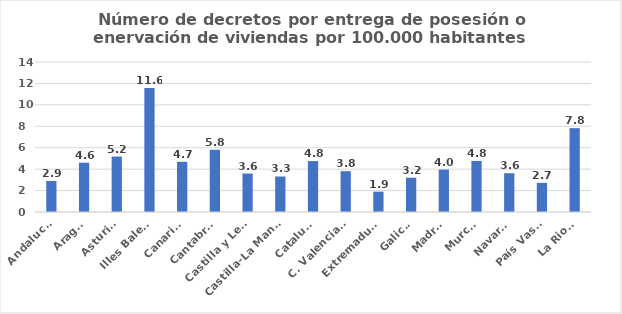
| Category | Numero de decretos por entrega de posesión o enervacion por 100.000 habitantes |
|---|---|
| Andalucía | 2.898 |
| Aragón | 4.603 |
| Asturias | 5.177 |
| Illes Balears | 11.562 |
| Canarias | 4.687 |
| Cantabria | 5.81 |
| Castilla y León | 3.586 |
| Castilla-La Mancha | 3.314 |
| Cataluña | 4.754 |
| C. Valenciana | 3.811 |
| Extremadura | 1.897 |
| Galicia | 3.198 |
| Madrid | 3.959 |
| Murcia | 4.767 |
| Navarra | 3.617 |
| País Vasco | 2.718 |
| La Rioja | 7.825 |